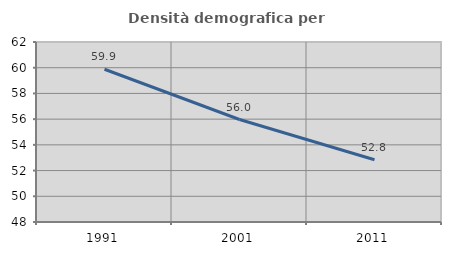
| Category | Densità demografica |
|---|---|
| 1991.0 | 59.88 |
| 2001.0 | 55.97 |
| 2011.0 | 52.843 |